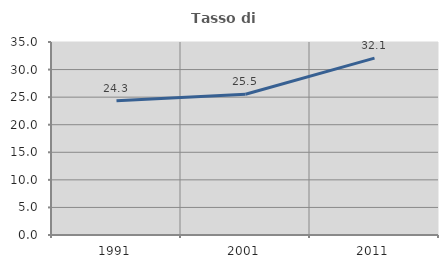
| Category | Tasso di occupazione   |
|---|---|
| 1991.0 | 24.348 |
| 2001.0 | 25.522 |
| 2011.0 | 32.075 |